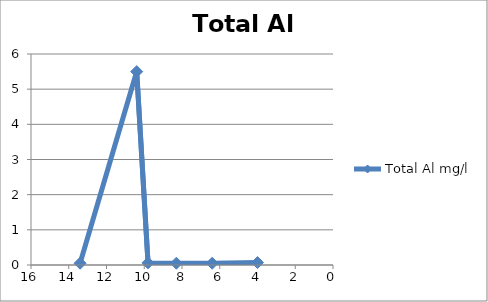
| Category | Total Al mg/l |
|---|---|
| 13.4 | 0.05 |
| 10.4 | 5.5 |
| 9.8 | 0.06 |
| 8.3 | 0.05 |
| 6.4 | 0.05 |
| 4.0 | 0.07 |